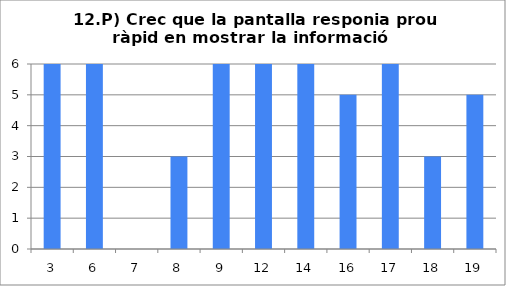
| Category | 12 |
|---|---|
| 3.0 | 6 |
| 6.0 | 6 |
| 7.0 | 0 |
| 8.0 | 3 |
| 9.0 | 6 |
| 12.0 | 6 |
| 14.0 | 6 |
| 16.0 | 5 |
| 17.0 | 6 |
| 18.0 | 3 |
| 19.0 | 5 |